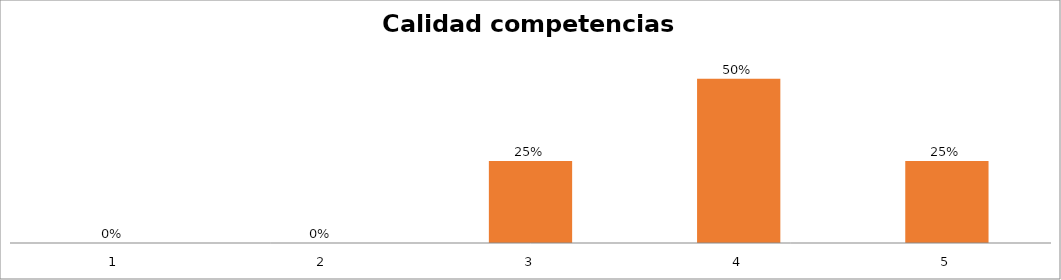
| Category | Series 1 |
|---|---|
| 0 | 0 |
| 1 | 0 |
| 2 | 0.25 |
| 3 | 0.5 |
| 4 | 0.25 |